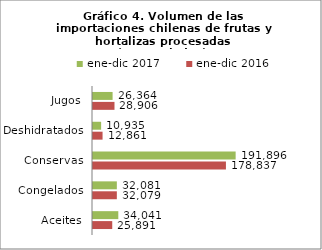
| Category | ene-dic 2016 | ene-dic 2017 |
|---|---|---|
| Aceites | 25891110.425 | 34041007.052 |
| Congelados | 32078562.682 | 32080893.422 |
| Conservas | 178837108.16 | 191895975.33 |
| Deshidratados | 12861452.45 | 10934515.41 |
| Jugos | 28906120.515 | 26363934.534 |